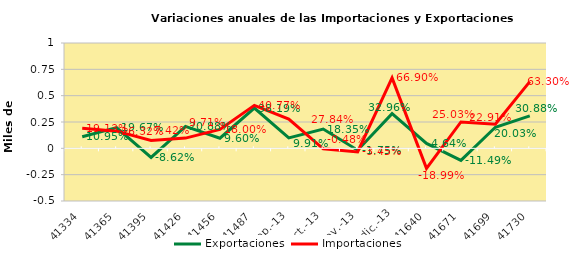
| Category | Exportaciones | Importaciones |
|---|---|---|
| 41334 | 0.109 | 0.191 |
| 41365 | 0.197 | 0.163 |
| 41395 | -0.086 | 0.074 |
| 41426 | 0.209 | 0.097 |
| 41456 | 0.096 | 0.18 |
| 41487 | 0.382 | 0.408 |
| sep.-13 | 0.099 | 0.278 |
| oct.-13 | 0.183 | -0.005 |
| nov.-13 | -0.017 | -0.035 |
| dic.-13 | 0.33 | 0.669 |
| 41640 | 0.046 | -0.19 |
| 41671 | -0.115 | 0.25 |
| 41699 | 0.2 | 0.229 |
| 41730 | 0.309 | 0.633 |